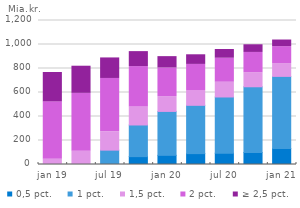
| Category | 0,5 pct. | 1 pct. | 1,5 pct. | 2 pct. | ≥ 2,5 pct. |
|---|---|---|---|---|---|
| jan 19 | 0 | 0 | 43.561 | 478.438 | 244.868 |
| apr 19 | 0 | 0.685 | 110.149 | 482.158 | 226.036 |
| jul 19 | 0 | 119.705 | 152.803 | 444.471 | 171.067 |
| okt 19 | 65.685 | 263.622 | 149.275 | 337.322 | 124.779 |
| jan 20 | 76.444 | 365.887 | 123.075 | 239.198 | 94.277 |
| apr 20 | 90.721 | 402.386 | 123.67 | 217.283 | 80.264 |
| jul 20 | 94.413 | 468.174 | 122.975 | 200.059 | 72.615 |
| okt 20 | 99.695 | 548.046 | 116.721 | 169.425 | 63.775 |
| jan 21 | 132.66 | 601.59 | 106.846 | 141.105 | 55.12 |